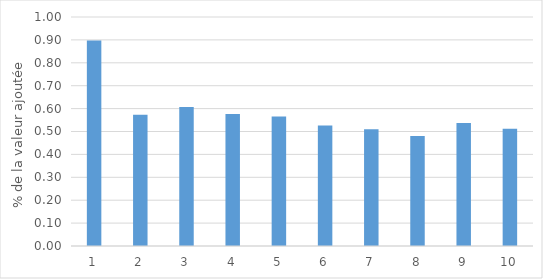
| Category | Part de la valeur ajoutée du décile |
|---|---|
| 1.0 | 0.898 |
| 2.0 | 0.573 |
| 3.0 | 0.607 |
| 4.0 | 0.576 |
| 5.0 | 0.565 |
| 6.0 | 0.526 |
| 7.0 | 0.509 |
| 8.0 | 0.48 |
| 9.0 | 0.538 |
| 10.0 | 0.512 |